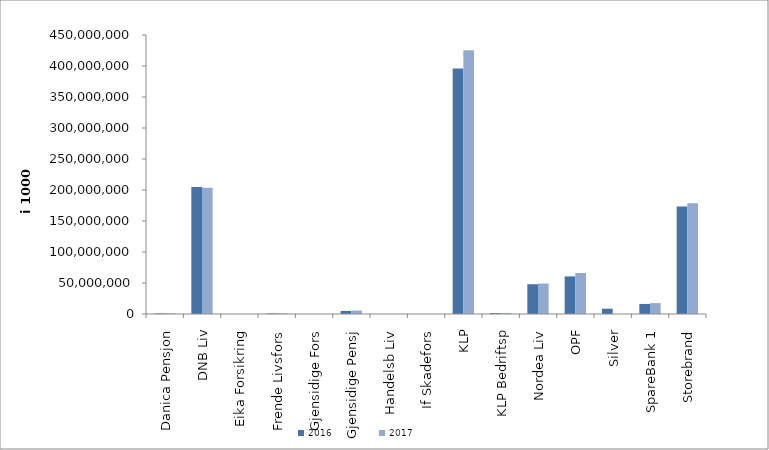
| Category | 2016 | 2017 |
|---|---|---|
| 0 | 915975.541 | 982925.819 |
| 1 | 204843063 | 203561162 |
| 2 | 0 | 0 |
| 3 | 923248 | 1045718 |
| 4 | 0 | 0 |
| 5 | 5002117.166 | 5573380 |
| 6 | 27041 | 27115 |
| 7 | 0 | 0 |
| 8 | 395861028.5 | 425409512.871 |
| 9 | 1377725 | 1459120 |
| 10 | 48033000.002 | 49076950 |
| 11 | 60671285 | 66115112 |
| 12 | 8551421.887 | 0 |
| 13 | 16191125.523 | 17555674.02 |
| 14 | 173422688.107 | 178438668.084 |